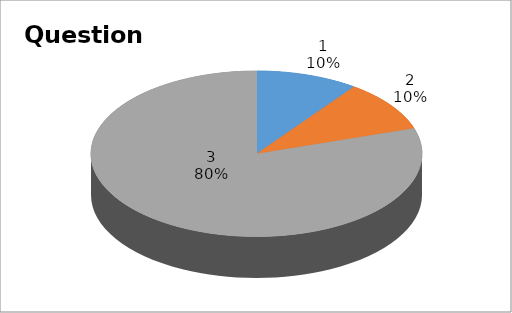
| Category | Series 0 |
|---|---|
| 0 | 1 |
| 1 | 1 |
| 2 | 8 |